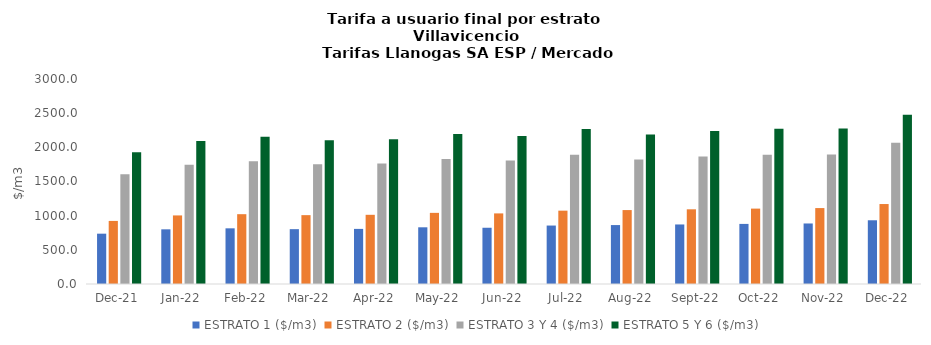
| Category | ESTRATO 1 ($/m3) | ESTRATO 2 ($/m3) | ESTRATO 3 Y 4 ($/m3) | ESTRATO 5 Y 6 ($/m3) |
|---|---|---|---|---|
| 2021-12-01 | 736.43 | 923.08 | 1606.27 | 1927.524 |
| 2022-01-01 | 800.06 | 1003.53 | 1745.17 | 2094.204 |
| 2022-02-01 | 814.71 | 1021.7 | 1795.42 | 2154.504 |
| 2022-03-01 | 802.54 | 1007.66 | 1753.7 | 2104.44 |
| 2022-04-01 | 806.47 | 1012.6 | 1765.16 | 2118.192 |
| 2022-05-01 | 829.82 | 1041.02 | 1827.98 | 2193.576 |
| 2022-06-01 | 823.08 | 1033.17 | 1805.61 | 2166.732 |
| 2022-07-01 | 855.48 | 1073.26 | 1889.9 | 2267.88 |
| 2022-08-01 | 862.41 | 1081.96 | 1822.3 | 2186.76 |
| 2022-09-01 | 871.27 | 1093.08 | 1865.58 | 2238.696 |
| 2022-10-01 | 879.42 | 1103.3 | 1892.31 | 2270.772 |
| 2022-11-01 | 885.71 | 1111.19 | 1896.63 | 2275.956 |
| 2022-12-01 | 932.64 | 1170.28 | 2065.26 | 2478.312 |